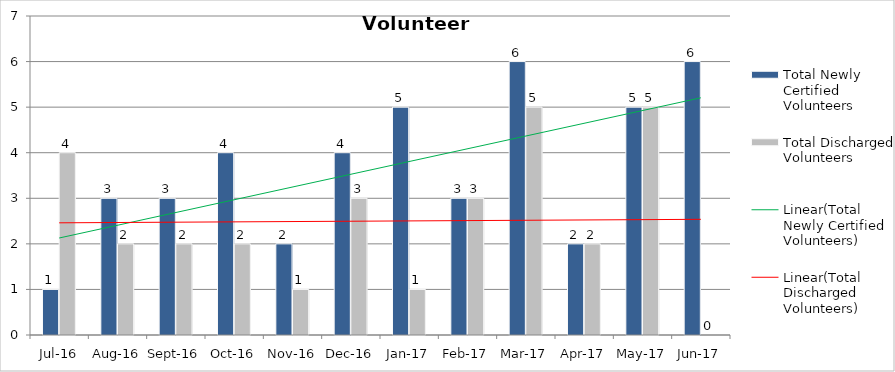
| Category | Total Newly Certified Volunteers | Total Discharged Volunteers |
|---|---|---|
| Jul-16 | 1 | 4 |
| Aug-16 | 3 | 2 |
| Sep-16 | 3 | 2 |
| Oct-16 | 4 | 2 |
| Nov-16 | 2 | 1 |
| Dec-16 | 4 | 3 |
| Jan-17 | 5 | 1 |
| Feb-17 | 3 | 3 |
| Mar-17 | 6 | 5 |
| Apr-17 | 2 | 2 |
| May-17 | 5 | 5 |
| Jun-17 | 6 | 0 |